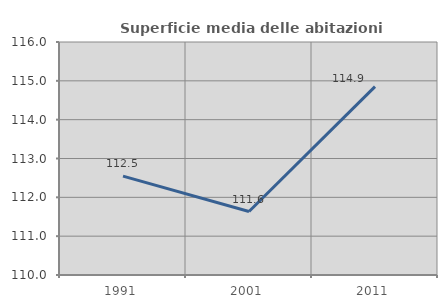
| Category | Superficie media delle abitazioni occupate |
|---|---|
| 1991.0 | 112.546 |
| 2001.0 | 111.634 |
| 2011.0 | 114.851 |